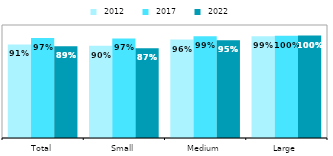
| Category |  2012 |  2017 |  2022 |
|---|---|---|---|
| Total | 0.911 | 0.974 | 0.892 |
| Small | 0.898 | 0.969 | 0.873 |
| Medium | 0.958 | 0.99 | 0.952 |
| Large | 0.991 | 0.996 | 0.997 |